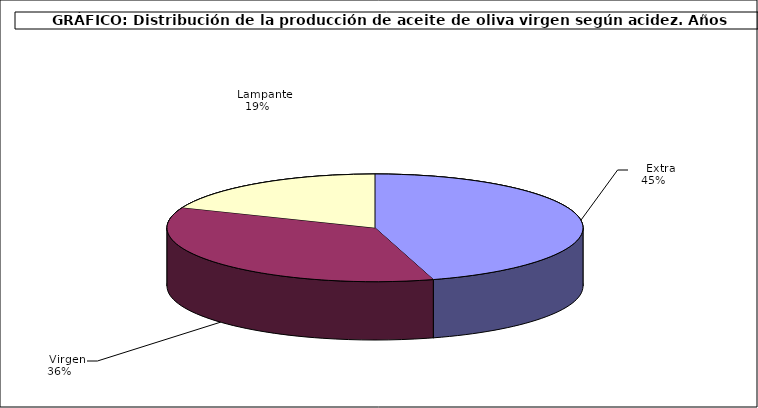
| Category | Series 0 |
|---|---|
|    Extra | 814207 |
|    Virgen | 639113 |
|    Lampante | 336988 |